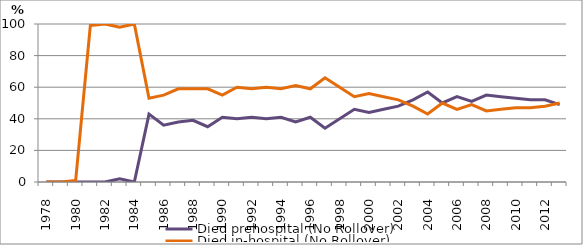
| Category | Died prehospital (No Rollover) | Died in-hospital (No Rollover) |
|---|---|---|
| 1978.0 | 0 | 0 |
| 1979.0 | 0 | 0 |
| 1980.0 | 0 | 1 |
| 1981.0 | 0 | 99 |
| 1982.0 | 0 | 100 |
| 1983.0 | 2 | 98 |
| 1984.0 | 0 | 100 |
| 1985.0 | 43 | 53 |
| 1986.0 | 36 | 55 |
| 1987.0 | 38 | 59 |
| 1988.0 | 39 | 59 |
| 1989.0 | 35 | 59 |
| 1990.0 | 41 | 55 |
| 1991.0 | 40 | 60 |
| 1992.0 | 41 | 59 |
| 1993.0 | 40 | 60 |
| 1994.0 | 41 | 59 |
| 1995.0 | 38 | 61 |
| 1996.0 | 41 | 59 |
| 1997.0 | 34 | 66 |
| 1998.0 | 40 | 60 |
| 1999.0 | 46 | 54 |
| 2000.0 | 44 | 56 |
| 2001.0 | 46 | 54 |
| 2002.0 | 48 | 52 |
| 2003.0 | 52 | 48 |
| 2004.0 | 57 | 43 |
| 2005.0 | 50 | 50 |
| 2006.0 | 54 | 46 |
| 2007.0 | 51 | 49 |
| 2008.0 | 55 | 45 |
| 2009.0 | 54 | 46 |
| 2010.0 | 53 | 47 |
| 2011.0 | 52 | 47 |
| 2012.0 | 52 | 48 |
| 2013.0 | 49 | 50 |